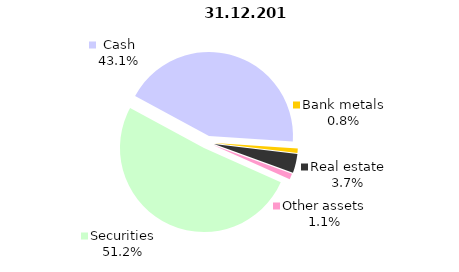
| Category | Total |
|---|---|
| Securities | 611.572 |
| Cash | 515.18 |
| Bank metals | 10.05 |
| Real estate | 43.763 |
| Other assets | 13.415 |